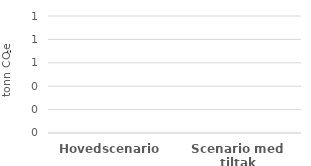
| Category | Bygningsmasse og uteområder | Byggeplass | Energibruk | Arealbruksendring |
|---|---|---|---|---|
| Hovedscenario | 0 | 0 | 0 | 0 |
| Scenario med tiltak | 0 | 0 | 0 | 0 |